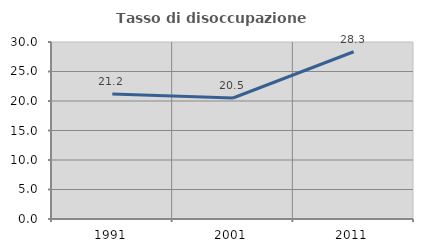
| Category | Tasso di disoccupazione giovanile  |
|---|---|
| 1991.0 | 21.174 |
| 2001.0 | 20.513 |
| 2011.0 | 28.346 |